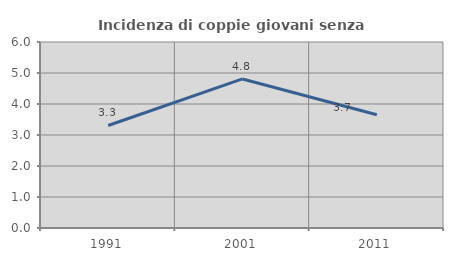
| Category | Incidenza di coppie giovani senza figli |
|---|---|
| 1991.0 | 3.308 |
| 2001.0 | 4.809 |
| 2011.0 | 3.655 |